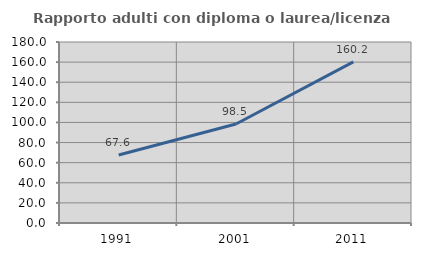
| Category | Rapporto adulti con diploma o laurea/licenza media  |
|---|---|
| 1991.0 | 67.629 |
| 2001.0 | 98.499 |
| 2011.0 | 160.165 |